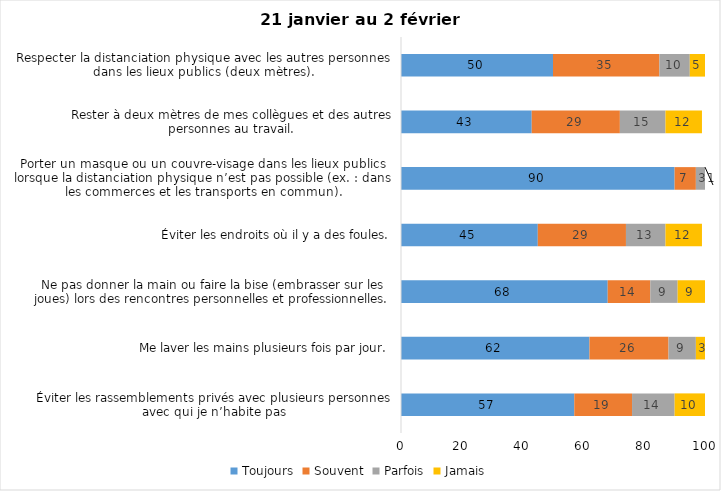
| Category | Toujours | Souvent | Parfois | Jamais |
|---|---|---|---|---|
| Éviter les rassemblements privés avec plusieurs personnes avec qui je n’habite pas | 57 | 19 | 14 | 10 |
| Me laver les mains plusieurs fois par jour. | 62 | 26 | 9 | 3 |
| Ne pas donner la main ou faire la bise (embrasser sur les joues) lors des rencontres personnelles et professionnelles. | 68 | 14 | 9 | 9 |
| Éviter les endroits où il y a des foules. | 45 | 29 | 13 | 12 |
| Porter un masque ou un couvre-visage dans les lieux publics lorsque la distanciation physique n’est pas possible (ex. : dans les commerces et les transports en commun). | 90 | 7 | 3 | 1 |
| Rester à deux mètres de mes collègues et des autres personnes au travail. | 43 | 29 | 15 | 12 |
| Respecter la distanciation physique avec les autres personnes dans les lieux publics (deux mètres). | 50 | 35 | 10 | 5 |